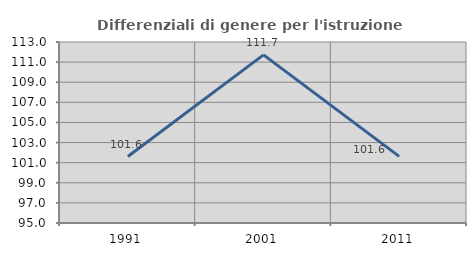
| Category | Differenziali di genere per l'istruzione superiore |
|---|---|
| 1991.0 | 101.611 |
| 2001.0 | 111.717 |
| 2011.0 | 101.626 |